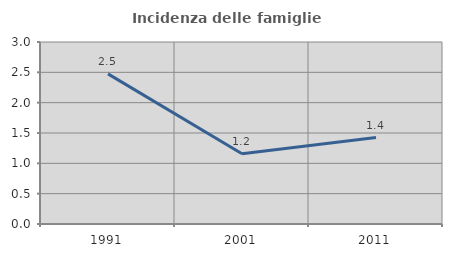
| Category | Incidenza delle famiglie numerose |
|---|---|
| 1991.0 | 2.475 |
| 2001.0 | 1.158 |
| 2011.0 | 1.425 |